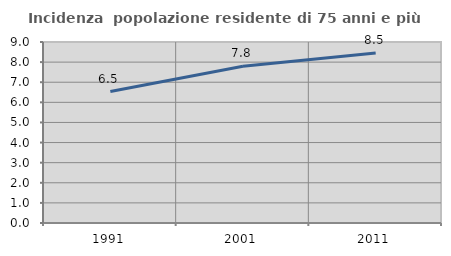
| Category | Incidenza  popolazione residente di 75 anni e più |
|---|---|
| 1991.0 | 6.536 |
| 2001.0 | 7.797 |
| 2011.0 | 8.454 |